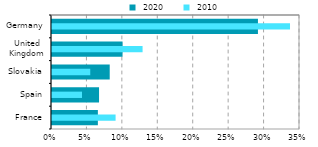
| Category |  2020 |
|---|---|
| France | 0.065 |
| Spain | 0.066 |
| Slovakia | 0.081 |
| United
Kingdom | 0.1 |
| Germany | 0.291 |